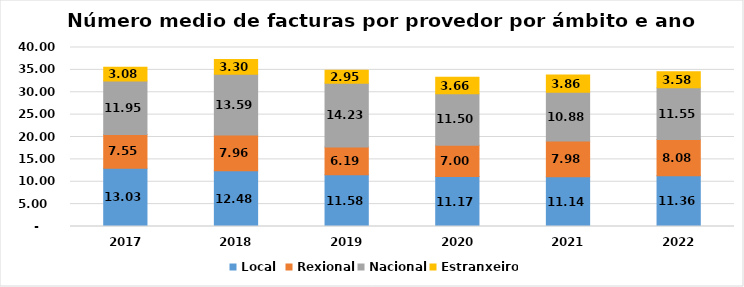
| Category | Local  | Rexional | Nacional | Estranxeiro |
|---|---|---|---|---|
| 2017.0 | 13.026 | 7.554 | 11.953 | 3.08 |
| 2018.0 | 12.478 | 7.958 | 13.589 | 3.3 |
| 2019.0 | 11.575 | 6.186 | 14.229 | 2.946 |
| 2020.0 | 11.173 | 7 | 11.504 | 3.658 |
| 2021.0 | 11.14 | 7.98 | 10.88 | 3.86 |
| 2022.0 | 11.357 | 8.076 | 11.549 | 3.576 |